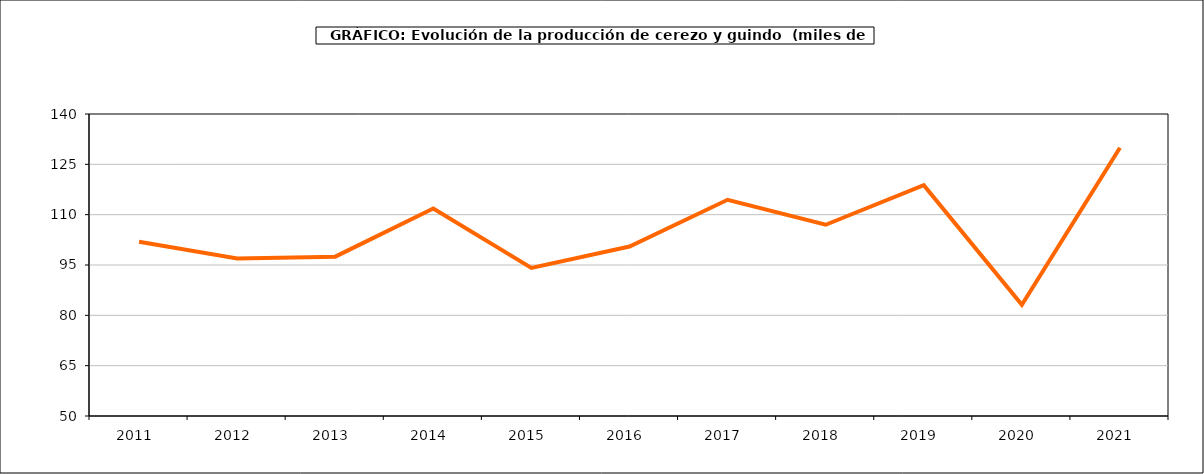
| Category | producción cerezo y guindo |
|---|---|
| 2011.0 | 101.945 |
| 2012.0 | 96.946 |
| 2013.0 | 97.489 |
| 2014.0 | 111.821 |
| 2015.0 | 94.143 |
| 2016.0 | 100.503 |
| 2017.0 | 114.433 |
| 2018.0 | 107 |
| 2019.0 | 118.762 |
| 2020.0 | 83.118 |
| 2021.0 | 129.933 |